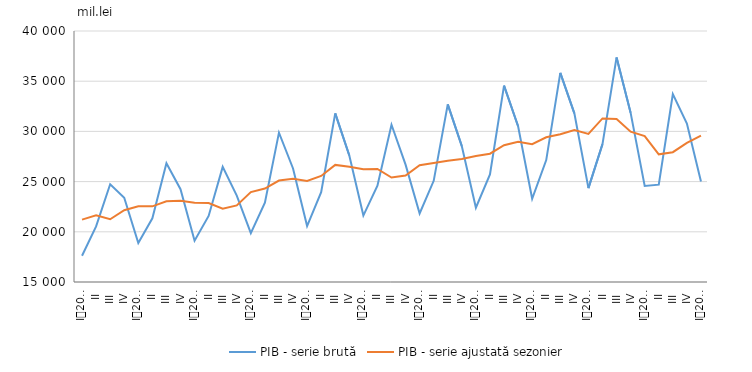
| Category | PIB - serie brută | PIB - serie ajustată sezonier |
|---|---|---|
| 0 | 17618.538 | 21215.041 |
| 1 | 20535.088 | 21639.883 |
| 2 | 24733.989 | 21251.894 |
| 3 | 23387.763 | 22152.492 |
| 4 | 18878.295 | 22537.099 |
| 5 | 21341.813 | 22538.073 |
| 6 | 26828.484 | 23048.294 |
| 7 | 24246.43 | 23102.826 |
| 8 | 19113.189 | 22894.758 |
| 9 | 21579.683 | 22866.716 |
| 10 | 26464.253 | 22295.751 |
| 11 | 23599.498 | 22624.036 |
| 12 | 19867.239 | 23953.063 |
| 13 | 22910.429 | 24305.456 |
| 14 | 29875.092 | 25106.836 |
| 15 | 26311.771 | 25281.69 |
| 16 | 20575.18 | 25062.433 |
| 17 | 23951.428 | 25565.256 |
| 18 | 31790.125 | 26661.49 |
| 19 | 27595.654 | 26480.579 |
| 20 | 21618.259 | 26236.43 |
| 21 | 24596.839 | 26264.666 |
| 22 | 30659.04 | 25401.13 |
| 23 | 26686.781 | 25609.796 |
| 24 | 21830.624 | 26630.292 |
| 25 | 25078.445 | 26850.042 |
| 26 | 32689.956 | 27080.764 |
| 27 | 28527.778 | 27249.89 |
| 28 | 22398.641 | 27559.428 |
| 29 | 25719.356 | 27777.869 |
| 30 | 34566.719 | 28622.675 |
| 31 | 30514.091 | 28959.162 |
| 32 | 23292.847 | 28720.98 |
| 33 | 27146.722 | 29413.779 |
| 34 | 35830.318 | 29710.773 |
| 35 | 31798.143 | 30124.515 |
| 36 | 24344.903 | 29749.981 |
| 37 | 28735.64 | 31294.322 |
| 38 | 37368.572 | 31228.091 |
| 39 | 31846.321 | 29970.383 |
| 40 | 24558.09 | 29537.12 |
| 41 | 24698.514 | 27714.526 |
| 42 | 33718.623 | 27927.786 |
| 43 | 30785.37 | 28855.986 |
| 44 | 25015.77 | 29576.629 |